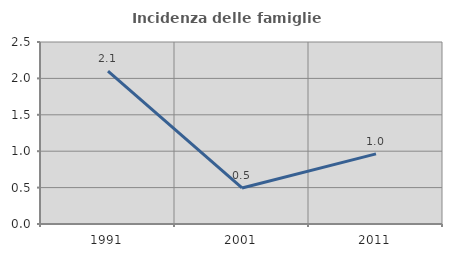
| Category | Incidenza delle famiglie numerose |
|---|---|
| 1991.0 | 2.101 |
| 2001.0 | 0.495 |
| 2011.0 | 0.964 |